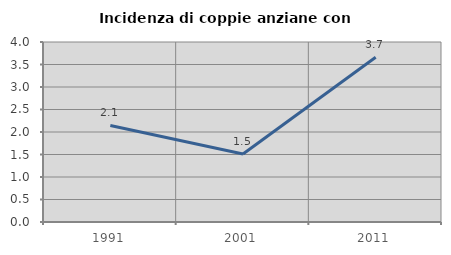
| Category | Incidenza di coppie anziane con figli |
|---|---|
| 1991.0 | 2.146 |
| 2001.0 | 1.509 |
| 2011.0 | 3.663 |